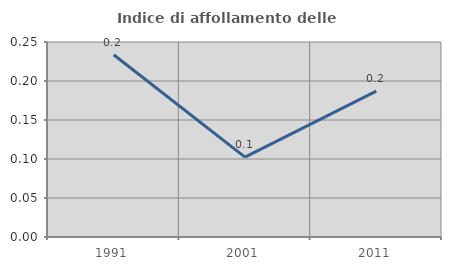
| Category | Indice di affollamento delle abitazioni  |
|---|---|
| 1991.0 | 0.234 |
| 2001.0 | 0.102 |
| 2011.0 | 0.187 |